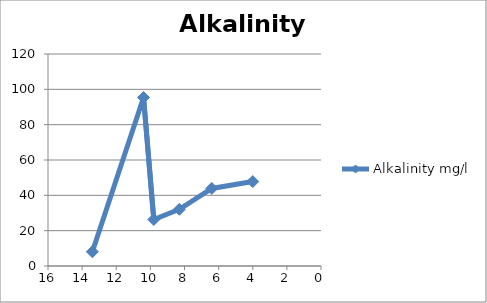
| Category | Alkalinity mg/l |
|---|---|
| 13.4 | 8.06 |
| 10.4 | 95.4 |
| 9.8 | 26.3 |
| 8.3 | 32.1 |
| 6.4 | 43.9 |
| 4.0 | 47.8 |